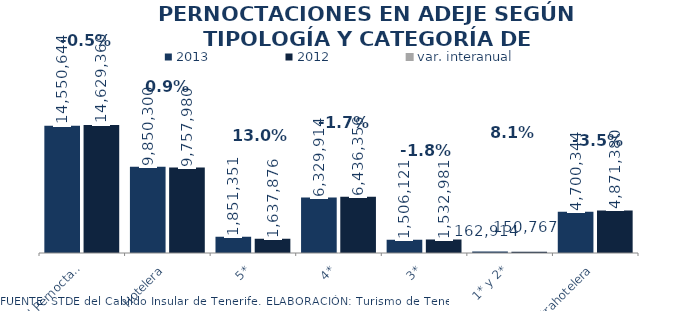
| Category | 2013 | 2012 |
|---|---|---|
| Total Pernoctaciones | 14550644 | 14629360 |
| Hotelera | 9850300 | 9757980 |
| 5* | 1851351 | 1637876 |
| 4* | 6329914 | 6436356 |
| 3* | 1506121 | 1532981 |
| 1* y 2* | 162914 | 150767 |
| Extrahotelera | 4700344 | 4871380 |